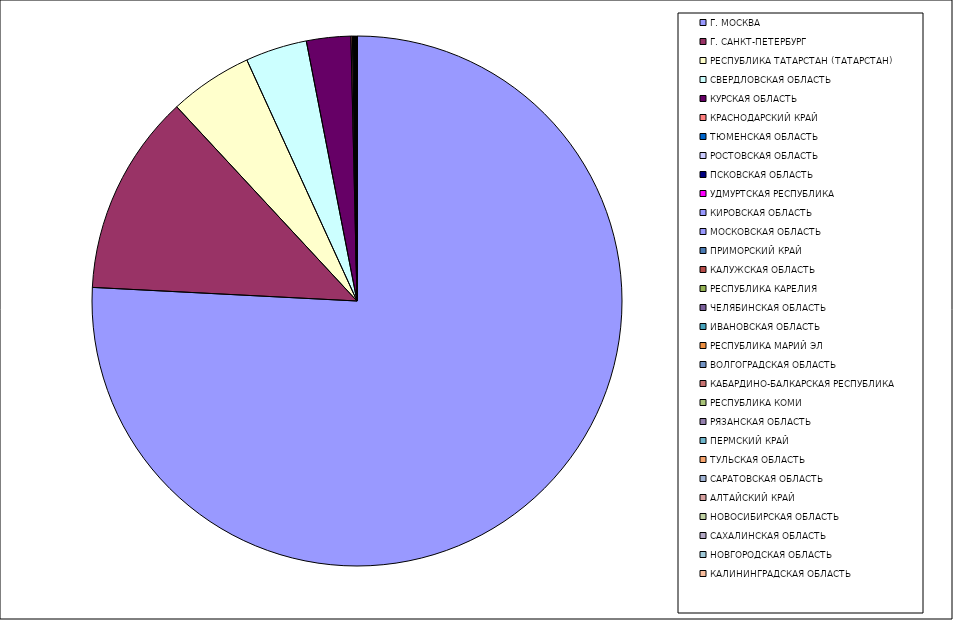
| Category | Оборот |
|---|---|
| Г. МОСКВА | 75.813 |
| Г. САНКТ-ПЕТЕРБУРГ | 12.274 |
| РЕСПУБЛИКА ТАТАРСТАН (ТАТАРСТАН) | 5.084 |
| СВЕРДЛОВСКАЯ ОБЛАСТЬ | 3.757 |
| КУРСКАЯ ОБЛАСТЬ | 2.7 |
| КРАСНОДАРСКИЙ КРАЙ | 0.091 |
| ТЮМЕНСКАЯ ОБЛАСТЬ | 0.061 |
| РОСТОВСКАЯ ОБЛАСТЬ | 0.04 |
| ПСКОВСКАЯ ОБЛАСТЬ | 0.019 |
| УДМУРТСКАЯ РЕСПУБЛИКА | 0.014 |
| КИРОВСКАЯ ОБЛАСТЬ | 0.013 |
| МОСКОВСКАЯ ОБЛАСТЬ | 0.013 |
| ПРИМОРСКИЙ КРАЙ | 0.013 |
| КАЛУЖСКАЯ ОБЛАСТЬ | 0.012 |
| РЕСПУБЛИКА КАРЕЛИЯ | 0.011 |
| ЧЕЛЯБИНСКАЯ ОБЛАСТЬ | 0.01 |
| ИВАНОВСКАЯ ОБЛАСТЬ | 0.009 |
| РЕСПУБЛИКА МАРИЙ ЭЛ | 0.009 |
| ВОЛГОГРАДСКАЯ ОБЛАСТЬ | 0.009 |
| КАБАРДИНО-БАЛКАРСКАЯ РЕСПУБЛИКА | 0.007 |
| РЕСПУБЛИКА КОМИ | 0.006 |
| РЯЗАНСКАЯ ОБЛАСТЬ | 0.006 |
| ПЕРМСКИЙ КРАЙ | 0.004 |
| ТУЛЬСКАЯ ОБЛАСТЬ | 0.004 |
| САРАТОВСКАЯ ОБЛАСТЬ | 0.003 |
| АЛТАЙСКИЙ КРАЙ | 0.003 |
| НОВОСИБИРСКАЯ ОБЛАСТЬ | 0.003 |
| САХАЛИНСКАЯ ОБЛАСТЬ | 0.002 |
| НОВГОРОДСКАЯ ОБЛАСТЬ | 0.002 |
| КАЛИНИНГРАДСКАЯ ОБЛАСТЬ | 0.002 |